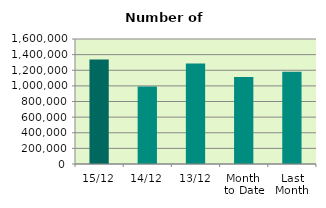
| Category | Series 0 |
|---|---|
| 15/12 | 1337530 |
| 14/12 | 990906 |
| 13/12 | 1286592 |
| Month 
to Date | 1114905.091 |
| Last
Month | 1182027.273 |